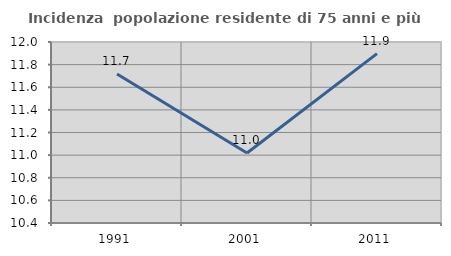
| Category | Incidenza  popolazione residente di 75 anni e più |
|---|---|
| 1991.0 | 11.717 |
| 2001.0 | 11.018 |
| 2011.0 | 11.897 |